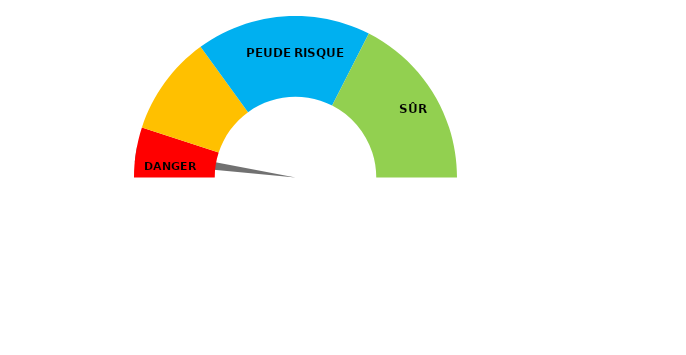
| Category | Series 1 |
|---|---|
| 0 | 3 |
| 1 | 3 |
| 2 | 194 |